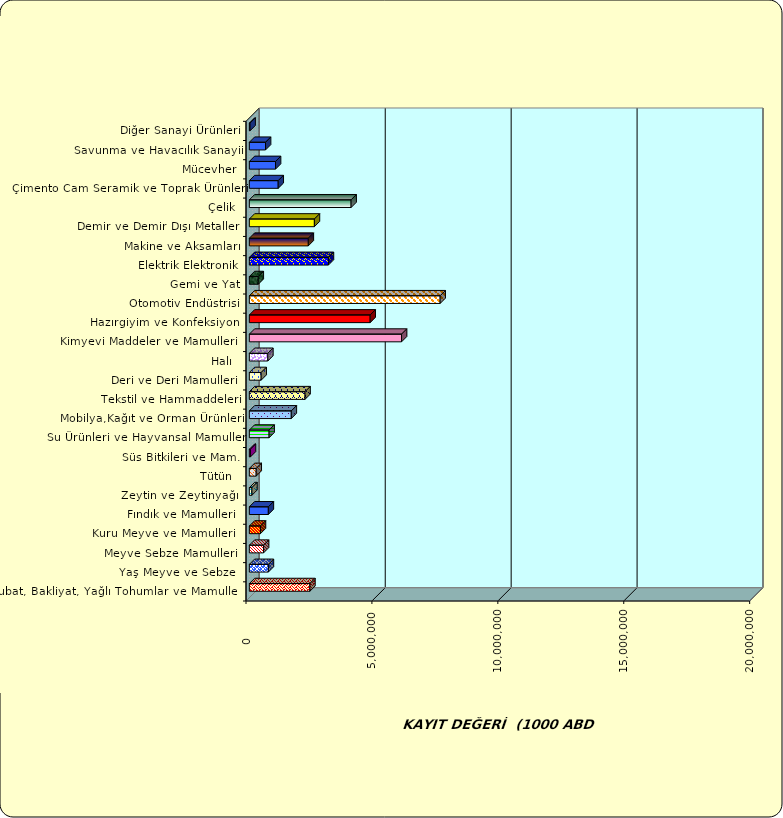
| Category | Series 0 |
|---|---|
|  Hububat, Bakliyat, Yağlı Tohumlar ve Mamulleri  | 2404926.199 |
|  Yaş Meyve ve Sebze   | 756301.072 |
|  Meyve Sebze Mamulleri  | 565431.692 |
|  Kuru Meyve ve Mamulleri   | 441118.703 |
|  Fındık ve Mamulleri  | 754256.861 |
|  Zeytin ve Zeytinyağı  | 101929.354 |
|  Tütün  | 272102.586 |
|  Süs Bitkileri ve Mam. | 43077.942 |
|  Su Ürünleri ve Hayvansal Mamuller | 784482.694 |
|  Mobilya,Kağıt ve Orman Ürünleri | 1666003.679 |
|  Tekstil ve Hammaddeleri | 2212000.62 |
|  Deri ve Deri Mamulleri  | 469426.457 |
|  Halı  | 734552.397 |
|  Kimyevi Maddeler ve Mamulleri   | 6044142.979 |
|  Hazırgiyim ve Konfeksiyon  | 4798017.958 |
|  Otomotiv Endüstrisi | 7576595.362 |
|  Gemi ve Yat | 354081.121 |
|  Elektrik Elektronik | 3139828.573 |
|  Makine ve Aksamları | 2341677.136 |
|  Demir ve Demir Dışı Metaller  | 2583186.273 |
|  Çelik | 4040775.292 |
|  Çimento Cam Seramik ve Toprak Ürünleri | 1146272.161 |
|  Mücevher | 1040080.261 |
|  Savunma ve Havacılık Sanayii | 643249.775 |
|  Diğer Sanayi Ürünleri | 28669.126 |